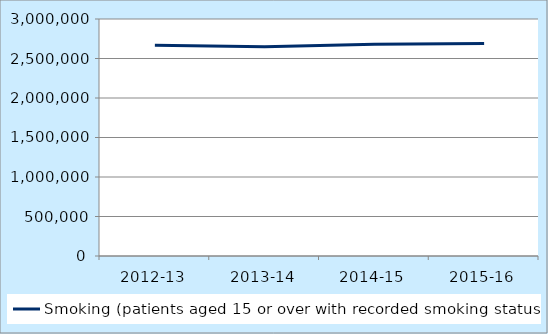
| Category | Smoking (patients aged 15 or over with recorded smoking status) |
|---|---|
| 2012-13 | 2666159 |
| 2013-14 | 2649437 |
| 2014-15 | 2680362 |
| 2015-16 | 2689419 |